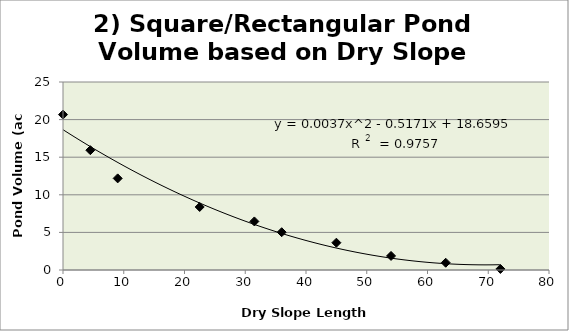
| Category | Series 0 |
|---|---|
| 72.0 | 0.141 |
| 63.0 | 0.965 |
| 54.0 | 1.869 |
| 45.0 | 3.632 |
| 36.0 | 5.026 |
| 31.5 | 6.458 |
| 22.5 | 8.38 |
| 9.0 | 12.183 |
| 4.5 | 15.932 |
| 0.0 | 20.665 |